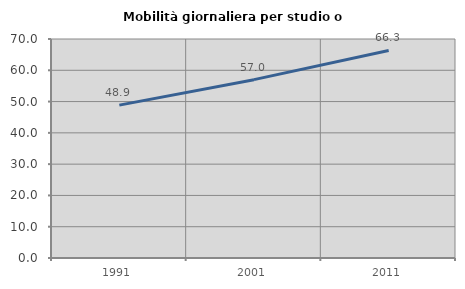
| Category | Mobilità giornaliera per studio o lavoro |
|---|---|
| 1991.0 | 48.869 |
| 2001.0 | 57.005 |
| 2011.0 | 66.329 |